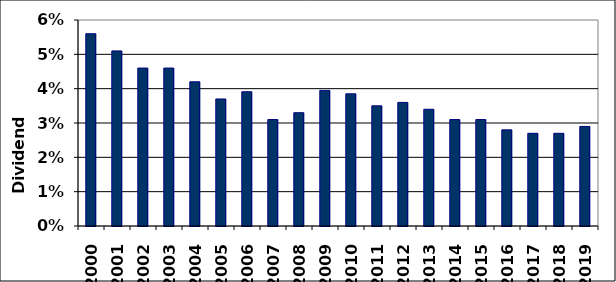
| Category | Series 0 |
|---|---|
| 2000.0 | 0.056 |
| 2001.0 | 0.051 |
| 2002.0 | 0.046 |
| 2003.0 | 0.046 |
| 2004.0 | 0.042 |
| 2005.0 | 0.037 |
| 2006.0 | 0.039 |
| 2007.0 | 0.031 |
| 2008.0 | 0.033 |
| 2009.0 | 0.04 |
| 2010.0 | 0.038 |
| 2011.0 | 0.035 |
| 2012.0 | 0.036 |
| 2013.0 | 0.034 |
| 2014.0 | 0.031 |
| 2015.0 | 0.031 |
| 2016.0 | 0.028 |
| 2017.0 | 0.027 |
| 2018.0 | 0.027 |
| 2019.0 | 0.029 |